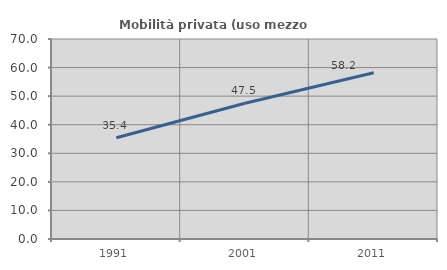
| Category | Mobilità privata (uso mezzo privato) |
|---|---|
| 1991.0 | 35.416 |
| 2001.0 | 47.52 |
| 2011.0 | 58.198 |